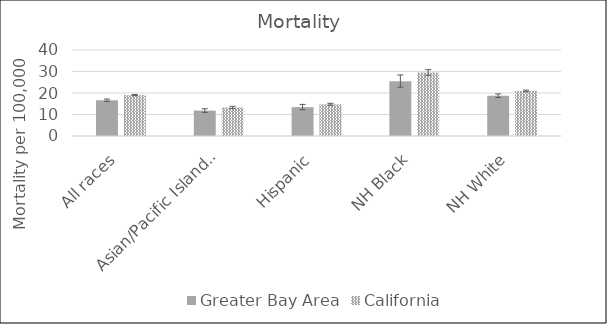
| Category | Greater Bay Area | California | US Mortality |
|---|---|---|---|
| All races | 16.61 | 19.02 |  |
| Asian/Pacific Islander | 11.82 | 13.28 |  |
| Hispanic | 13.41 | 14.75 |  |
| NH Black | 25.42 | 29.51 |  |
| NH White | 18.73 | 20.94 |  |